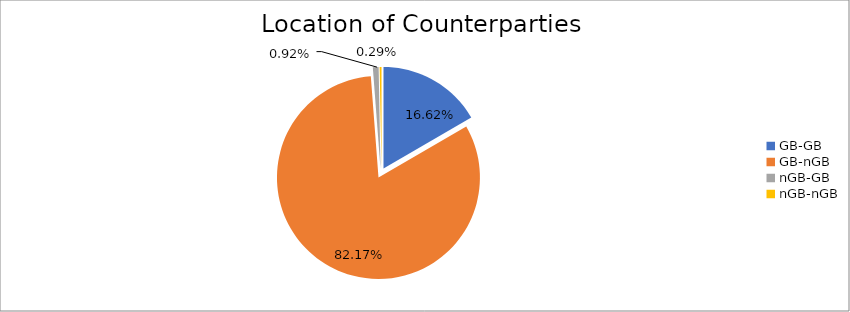
| Category | Series 0 |
|---|---|
| GB-GB | 1548630.528 |
| GB-nGB | 7657368.324 |
| nGB-GB | 85349.451 |
| nGB-nGB | 27225.441 |